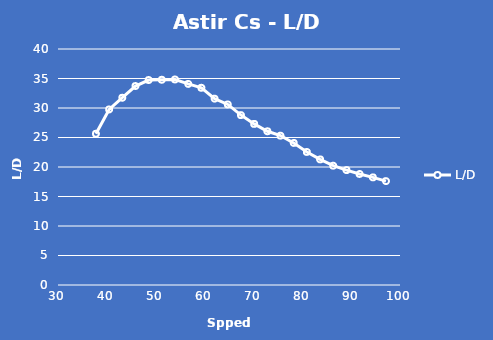
| Category | L/D |
|---|---|
| 37.772827738637936 | 25.635 |
| 40.470886862826355 | 29.755 |
| 43.16894598701478 | 31.739 |
| 45.867005111203206 | 33.722 |
| 48.56506423539163 | 34.741 |
| 51.26312335958006 | 34.79 |
| 53.961182483768475 | 34.835 |
| 56.6592416079569 | 34.083 |
| 59.357300732145326 | 33.427 |
| 62.05535985633375 | 31.586 |
| 64.75341898052217 | 30.605 |
| 67.4514781047106 | 28.795 |
| 70.14953722889902 | 27.305 |
| 72.84759635308744 | 26.056 |
| 75.54565547727587 | 25.311 |
| 78.24371460146429 | 24.081 |
| 80.94177372565271 | 22.551 |
| 83.63983284984114 | 21.286 |
| 86.33789197402956 | 20.223 |
| 89.03595109821799 | 19.476 |
| 91.73401022240641 | 18.822 |
| 94.43206934659483 | 18.244 |
| 97.13012847078326 | 17.608 |